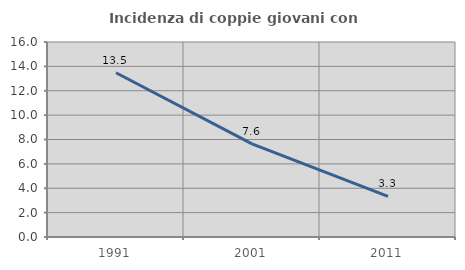
| Category | Incidenza di coppie giovani con figli |
|---|---|
| 1991.0 | 13.476 |
| 2001.0 | 7.645 |
| 2011.0 | 3.336 |